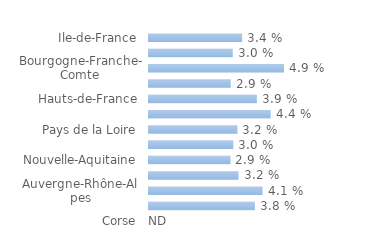
| Category | Series 0 |
|---|---|
| Ile-de-France | 0.034 |
| Centre-Val-de-Loire | 0.03 |
| Bourgogne-Franche-Comte | 0.049 |
| Normandie | 0.029 |
| Hauts-de-France | 0.039 |
| Grand-Est | 0.044 |
| Pays de la Loire | 0.032 |
| Bretagne | 0.03 |
| Nouvelle-Aquitaine | 0.029 |
| Occitanie | 0.032 |
| Auvergne-Rhône-Alpes | 0.041 |
| Provence-Alpes-Côte d'Azur | 0.038 |
| Corse | 0 |